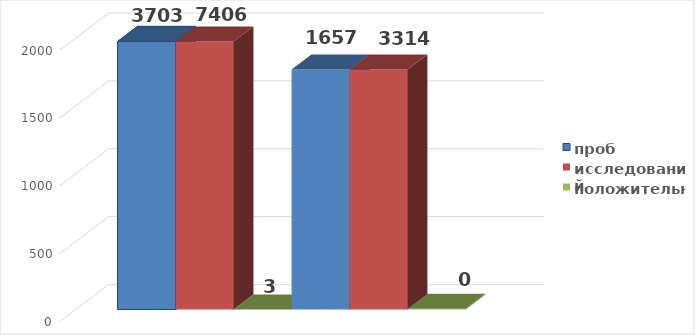
| Category | проб | исследований | положительных | Series 3 | Series 5 | Series 6 |
|---|---|---|---|---|---|---|
| 0 | 1975 | 1975 | 0 | 1768 | 1768 | 5 |